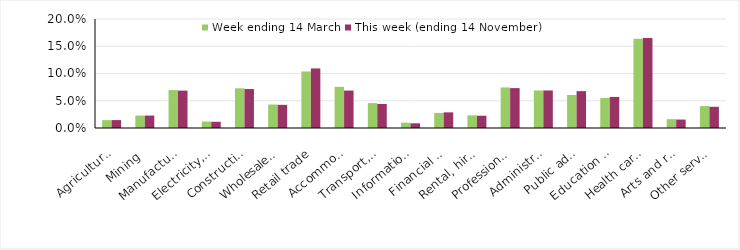
| Category | Week ending 14 March | This week (ending 14 November) |
|---|---|---|
| Agriculture, forestry and fishing | 0.014 | 0.014 |
| Mining | 0.023 | 0.023 |
| Manufacturing | 0.07 | 0.069 |
| Electricity, gas, water and waste services | 0.012 | 0.011 |
| Construction | 0.073 | 0.072 |
| Wholesale trade | 0.043 | 0.042 |
| Retail trade | 0.104 | 0.109 |
| Accommodation and food services | 0.076 | 0.069 |
| Transport, postal and warehousing | 0.046 | 0.044 |
| Information media and telecommunications | 0.01 | 0.009 |
| Financial and insurance services | 0.028 | 0.029 |
| Rental, hiring and real estate services | 0.023 | 0.022 |
| Professional, scientific and technical services | 0.074 | 0.073 |
| Administrative and support services | 0.069 | 0.069 |
| Public administration and safety | 0.061 | 0.068 |
| Education and training | 0.055 | 0.057 |
| Health care and social assistance | 0.164 | 0.165 |
| Arts and recreation services | 0.016 | 0.016 |
| Other services | 0.04 | 0.039 |